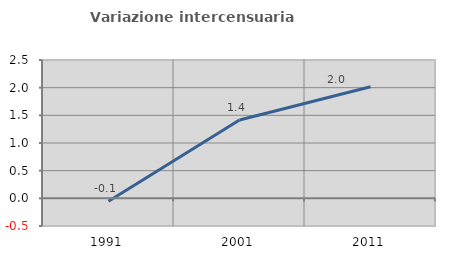
| Category | Variazione intercensuaria annua |
|---|---|
| 1991.0 | -0.052 |
| 2001.0 | 1.415 |
| 2011.0 | 2.016 |